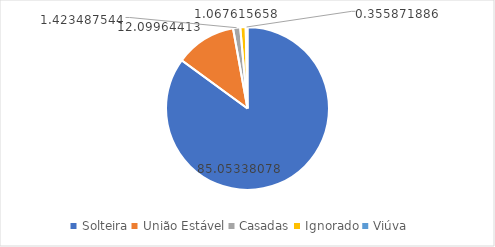
| Category | Series 0 |
|---|---|
| Solteira | 85.053 |
| União Estável | 12.1 |
| Casadas | 1.423 |
| Ignorado | 1.068 |
| Viúva | 0.356 |